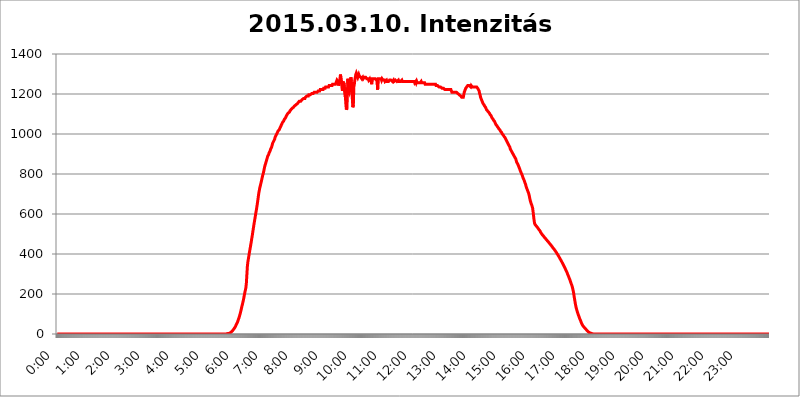
| Category | 2015.03.10. Intenzitás [W/m^2] |
|---|---|
| 0.0 | -0.256 |
| 0.0006944444444444445 | -0.256 |
| 0.001388888888888889 | -0.256 |
| 0.0020833333333333333 | -0.256 |
| 0.002777777777777778 | -0.256 |
| 0.003472222222222222 | -0.256 |
| 0.004166666666666667 | -0.256 |
| 0.004861111111111111 | -0.256 |
| 0.005555555555555556 | -0.256 |
| 0.0062499999999999995 | -0.256 |
| 0.006944444444444444 | -0.256 |
| 0.007638888888888889 | -0.256 |
| 0.008333333333333333 | -0.256 |
| 0.009027777777777779 | -0.256 |
| 0.009722222222222222 | -0.256 |
| 0.010416666666666666 | -0.256 |
| 0.011111111111111112 | -0.256 |
| 0.011805555555555555 | -0.256 |
| 0.012499999999999999 | -0.256 |
| 0.013194444444444444 | -0.256 |
| 0.013888888888888888 | -0.256 |
| 0.014583333333333332 | -0.256 |
| 0.015277777777777777 | -0.256 |
| 0.015972222222222224 | -0.256 |
| 0.016666666666666666 | -0.256 |
| 0.017361111111111112 | -0.256 |
| 0.018055555555555557 | -0.256 |
| 0.01875 | -0.256 |
| 0.019444444444444445 | -0.256 |
| 0.02013888888888889 | -0.256 |
| 0.020833333333333332 | -0.256 |
| 0.02152777777777778 | -0.256 |
| 0.022222222222222223 | -0.256 |
| 0.02291666666666667 | -0.256 |
| 0.02361111111111111 | -0.256 |
| 0.024305555555555556 | -0.256 |
| 0.024999999999999998 | -0.256 |
| 0.025694444444444447 | -0.256 |
| 0.02638888888888889 | -0.256 |
| 0.027083333333333334 | -0.256 |
| 0.027777777777777776 | -0.256 |
| 0.02847222222222222 | -0.256 |
| 0.029166666666666664 | -0.256 |
| 0.029861111111111113 | -0.256 |
| 0.030555555555555555 | -0.256 |
| 0.03125 | -0.256 |
| 0.03194444444444445 | -0.256 |
| 0.03263888888888889 | -0.256 |
| 0.03333333333333333 | -0.256 |
| 0.034027777777777775 | -0.256 |
| 0.034722222222222224 | -0.256 |
| 0.035416666666666666 | -0.256 |
| 0.036111111111111115 | -0.256 |
| 0.03680555555555556 | -0.256 |
| 0.0375 | -0.256 |
| 0.03819444444444444 | -0.256 |
| 0.03888888888888889 | -0.256 |
| 0.03958333333333333 | -0.256 |
| 0.04027777777777778 | -0.256 |
| 0.04097222222222222 | -0.256 |
| 0.041666666666666664 | -0.256 |
| 0.042361111111111106 | -0.256 |
| 0.04305555555555556 | -0.256 |
| 0.043750000000000004 | -0.256 |
| 0.044444444444444446 | -0.256 |
| 0.04513888888888889 | -0.256 |
| 0.04583333333333334 | -0.256 |
| 0.04652777777777778 | -0.256 |
| 0.04722222222222222 | -0.256 |
| 0.04791666666666666 | -0.256 |
| 0.04861111111111111 | -0.256 |
| 0.049305555555555554 | -0.256 |
| 0.049999999999999996 | -0.256 |
| 0.05069444444444445 | -0.256 |
| 0.051388888888888894 | -0.256 |
| 0.052083333333333336 | -0.256 |
| 0.05277777777777778 | -0.256 |
| 0.05347222222222222 | -0.256 |
| 0.05416666666666667 | -0.256 |
| 0.05486111111111111 | -0.256 |
| 0.05555555555555555 | -0.256 |
| 0.05625 | -0.256 |
| 0.05694444444444444 | -0.256 |
| 0.057638888888888885 | -0.256 |
| 0.05833333333333333 | -0.256 |
| 0.05902777777777778 | -0.256 |
| 0.059722222222222225 | -0.256 |
| 0.06041666666666667 | -0.256 |
| 0.061111111111111116 | -0.256 |
| 0.06180555555555556 | -0.256 |
| 0.0625 | -0.256 |
| 0.06319444444444444 | -0.256 |
| 0.06388888888888888 | -0.256 |
| 0.06458333333333334 | -0.256 |
| 0.06527777777777778 | -0.256 |
| 0.06597222222222222 | -0.256 |
| 0.06666666666666667 | -0.256 |
| 0.06736111111111111 | -0.256 |
| 0.06805555555555555 | -0.256 |
| 0.06874999999999999 | -0.256 |
| 0.06944444444444443 | -0.256 |
| 0.07013888888888889 | -0.256 |
| 0.07083333333333333 | -0.256 |
| 0.07152777777777779 | -0.256 |
| 0.07222222222222223 | -0.256 |
| 0.07291666666666667 | -0.256 |
| 0.07361111111111111 | -0.256 |
| 0.07430555555555556 | -0.256 |
| 0.075 | -0.256 |
| 0.07569444444444444 | -0.256 |
| 0.0763888888888889 | -0.256 |
| 0.07708333333333334 | -0.256 |
| 0.07777777777777778 | -0.256 |
| 0.07847222222222222 | -0.256 |
| 0.07916666666666666 | -0.256 |
| 0.0798611111111111 | -0.256 |
| 0.08055555555555556 | -0.256 |
| 0.08125 | -0.256 |
| 0.08194444444444444 | -0.256 |
| 0.08263888888888889 | -0.256 |
| 0.08333333333333333 | -0.256 |
| 0.08402777777777777 | -0.256 |
| 0.08472222222222221 | -0.256 |
| 0.08541666666666665 | -0.256 |
| 0.08611111111111112 | -0.256 |
| 0.08680555555555557 | -0.256 |
| 0.08750000000000001 | -0.256 |
| 0.08819444444444445 | -0.256 |
| 0.08888888888888889 | -0.256 |
| 0.08958333333333333 | -0.256 |
| 0.09027777777777778 | -0.256 |
| 0.09097222222222222 | -0.256 |
| 0.09166666666666667 | -0.256 |
| 0.09236111111111112 | -0.256 |
| 0.09305555555555556 | -0.256 |
| 0.09375 | -0.256 |
| 0.09444444444444444 | -0.256 |
| 0.09513888888888888 | -0.256 |
| 0.09583333333333333 | -0.256 |
| 0.09652777777777777 | -0.256 |
| 0.09722222222222222 | -0.256 |
| 0.09791666666666667 | -0.256 |
| 0.09861111111111111 | -0.256 |
| 0.09930555555555555 | -0.256 |
| 0.09999999999999999 | -0.256 |
| 0.10069444444444443 | -0.256 |
| 0.1013888888888889 | -0.256 |
| 0.10208333333333335 | -0.256 |
| 0.10277777777777779 | -0.256 |
| 0.10347222222222223 | -0.256 |
| 0.10416666666666667 | -0.256 |
| 0.10486111111111111 | -0.256 |
| 0.10555555555555556 | -0.256 |
| 0.10625 | -0.256 |
| 0.10694444444444444 | -0.256 |
| 0.1076388888888889 | -0.256 |
| 0.10833333333333334 | -0.256 |
| 0.10902777777777778 | -0.256 |
| 0.10972222222222222 | -0.256 |
| 0.1111111111111111 | -0.256 |
| 0.11180555555555556 | -0.256 |
| 0.11180555555555556 | -0.256 |
| 0.1125 | -0.256 |
| 0.11319444444444444 | -0.256 |
| 0.11388888888888889 | -0.256 |
| 0.11458333333333333 | -0.256 |
| 0.11527777777777777 | -0.256 |
| 0.11597222222222221 | -0.256 |
| 0.11666666666666665 | -0.256 |
| 0.1173611111111111 | -0.256 |
| 0.11805555555555557 | -0.256 |
| 0.11944444444444445 | -0.256 |
| 0.12013888888888889 | -0.256 |
| 0.12083333333333333 | -0.256 |
| 0.12152777777777778 | -0.256 |
| 0.12222222222222223 | -0.256 |
| 0.12291666666666667 | -0.256 |
| 0.12291666666666667 | -0.256 |
| 0.12361111111111112 | -0.256 |
| 0.12430555555555556 | -0.256 |
| 0.125 | -0.256 |
| 0.12569444444444444 | -0.256 |
| 0.12638888888888888 | -0.256 |
| 0.12708333333333333 | -0.256 |
| 0.16875 | -0.256 |
| 0.12847222222222224 | -0.256 |
| 0.12916666666666668 | -0.256 |
| 0.12986111111111112 | -0.256 |
| 0.13055555555555556 | -0.256 |
| 0.13125 | -0.256 |
| 0.13194444444444445 | -0.256 |
| 0.1326388888888889 | -0.256 |
| 0.13333333333333333 | -0.256 |
| 0.13402777777777777 | -0.256 |
| 0.13402777777777777 | -0.256 |
| 0.13472222222222222 | -0.256 |
| 0.13541666666666666 | -0.256 |
| 0.1361111111111111 | -0.256 |
| 0.13749999999999998 | -0.256 |
| 0.13819444444444443 | -0.256 |
| 0.1388888888888889 | -0.256 |
| 0.13958333333333334 | -0.256 |
| 0.14027777777777778 | -0.256 |
| 0.14097222222222222 | -0.256 |
| 0.14166666666666666 | -0.256 |
| 0.1423611111111111 | -0.256 |
| 0.14305555555555557 | -0.256 |
| 0.14375000000000002 | -0.256 |
| 0.14444444444444446 | -0.256 |
| 0.1451388888888889 | -0.256 |
| 0.1451388888888889 | -0.256 |
| 0.14652777777777778 | -0.256 |
| 0.14722222222222223 | -0.256 |
| 0.14791666666666667 | -0.256 |
| 0.1486111111111111 | -0.256 |
| 0.14930555555555555 | -0.256 |
| 0.15 | -0.256 |
| 0.15069444444444444 | -0.256 |
| 0.15138888888888888 | -0.256 |
| 0.15208333333333332 | -0.256 |
| 0.15277777777777776 | -0.256 |
| 0.15347222222222223 | -0.256 |
| 0.15416666666666667 | -0.256 |
| 0.15486111111111112 | -0.256 |
| 0.15555555555555556 | -0.256 |
| 0.15625 | -0.256 |
| 0.15694444444444444 | -0.256 |
| 0.15763888888888888 | -0.256 |
| 0.15833333333333333 | -0.256 |
| 0.15902777777777777 | -0.256 |
| 0.15972222222222224 | -0.256 |
| 0.16041666666666668 | -0.256 |
| 0.16111111111111112 | -0.256 |
| 0.16180555555555556 | -0.256 |
| 0.1625 | -0.256 |
| 0.16319444444444445 | -0.256 |
| 0.1638888888888889 | -0.256 |
| 0.16458333333333333 | -0.256 |
| 0.16527777777777777 | -0.256 |
| 0.16597222222222222 | -0.256 |
| 0.16666666666666666 | -0.256 |
| 0.1673611111111111 | -0.256 |
| 0.16805555555555554 | -0.256 |
| 0.16874999999999998 | -0.256 |
| 0.16944444444444443 | -0.256 |
| 0.17013888888888887 | -0.256 |
| 0.1708333333333333 | -0.256 |
| 0.17152777777777775 | -0.256 |
| 0.17222222222222225 | -0.256 |
| 0.1729166666666667 | -0.256 |
| 0.17361111111111113 | -0.256 |
| 0.17430555555555557 | -0.256 |
| 0.17500000000000002 | -0.256 |
| 0.17569444444444446 | -0.256 |
| 0.1763888888888889 | -0.256 |
| 0.17708333333333334 | -0.256 |
| 0.17777777777777778 | -0.256 |
| 0.17847222222222223 | -0.256 |
| 0.17916666666666667 | -0.256 |
| 0.1798611111111111 | -0.256 |
| 0.18055555555555555 | -0.256 |
| 0.18125 | -0.256 |
| 0.18194444444444444 | -0.256 |
| 0.1826388888888889 | -0.256 |
| 0.18333333333333335 | -0.256 |
| 0.1840277777777778 | -0.256 |
| 0.18472222222222223 | -0.256 |
| 0.18541666666666667 | -0.256 |
| 0.18611111111111112 | -0.256 |
| 0.18680555555555556 | -0.256 |
| 0.1875 | -0.256 |
| 0.18819444444444444 | -0.256 |
| 0.18888888888888888 | -0.256 |
| 0.18958333333333333 | -0.256 |
| 0.19027777777777777 | -0.256 |
| 0.1909722222222222 | -0.256 |
| 0.19166666666666665 | -0.256 |
| 0.19236111111111112 | -0.256 |
| 0.19305555555555554 | -0.256 |
| 0.19375 | -0.256 |
| 0.19444444444444445 | -0.256 |
| 0.1951388888888889 | -0.256 |
| 0.19583333333333333 | -0.256 |
| 0.19652777777777777 | -0.256 |
| 0.19722222222222222 | -0.256 |
| 0.19791666666666666 | -0.256 |
| 0.1986111111111111 | -0.256 |
| 0.19930555555555554 | -0.256 |
| 0.19999999999999998 | -0.256 |
| 0.20069444444444443 | -0.256 |
| 0.20138888888888887 | -0.256 |
| 0.2020833333333333 | -0.256 |
| 0.2027777777777778 | -0.256 |
| 0.2034722222222222 | -0.256 |
| 0.2041666666666667 | -0.256 |
| 0.20486111111111113 | -0.256 |
| 0.20555555555555557 | -0.256 |
| 0.20625000000000002 | -0.256 |
| 0.20694444444444446 | -0.256 |
| 0.2076388888888889 | -0.256 |
| 0.20833333333333334 | -0.256 |
| 0.20902777777777778 | -0.256 |
| 0.20972222222222223 | -0.256 |
| 0.21041666666666667 | -0.256 |
| 0.2111111111111111 | -0.256 |
| 0.21180555555555555 | -0.256 |
| 0.2125 | -0.256 |
| 0.21319444444444444 | -0.256 |
| 0.2138888888888889 | -0.256 |
| 0.21458333333333335 | -0.256 |
| 0.2152777777777778 | -0.256 |
| 0.21597222222222223 | -0.256 |
| 0.21666666666666667 | -0.256 |
| 0.21736111111111112 | -0.256 |
| 0.21805555555555556 | -0.256 |
| 0.21875 | -0.256 |
| 0.21944444444444444 | -0.256 |
| 0.22013888888888888 | -0.256 |
| 0.22083333333333333 | -0.256 |
| 0.22152777777777777 | -0.256 |
| 0.2222222222222222 | -0.256 |
| 0.22291666666666665 | -0.256 |
| 0.2236111111111111 | -0.256 |
| 0.22430555555555556 | -0.256 |
| 0.225 | -0.256 |
| 0.22569444444444445 | -0.256 |
| 0.2263888888888889 | -0.256 |
| 0.22708333333333333 | -0.256 |
| 0.22777777777777777 | -0.256 |
| 0.22847222222222222 | -0.256 |
| 0.22916666666666666 | -0.256 |
| 0.2298611111111111 | -0.256 |
| 0.23055555555555554 | -0.256 |
| 0.23124999999999998 | -0.256 |
| 0.23194444444444443 | -0.256 |
| 0.23263888888888887 | -0.256 |
| 0.2333333333333333 | -0.256 |
| 0.2340277777777778 | -0.256 |
| 0.2347222222222222 | -0.256 |
| 0.2354166666666667 | -0.256 |
| 0.23611111111111113 | -0.256 |
| 0.23680555555555557 | -0.256 |
| 0.23750000000000002 | 1.09 |
| 0.23819444444444446 | 1.09 |
| 0.2388888888888889 | 1.09 |
| 0.23958333333333334 | 2.439 |
| 0.24027777777777778 | 2.439 |
| 0.24097222222222223 | 3.791 |
| 0.24166666666666667 | 3.791 |
| 0.2423611111111111 | 6.503 |
| 0.24305555555555555 | 7.862 |
| 0.24375 | 9.225 |
| 0.24444444444444446 | 10.589 |
| 0.24513888888888888 | 13.325 |
| 0.24583333333333335 | 16.069 |
| 0.2465277777777778 | 18.822 |
| 0.24722222222222223 | 22.965 |
| 0.24791666666666667 | 25.736 |
| 0.24861111111111112 | 29.905 |
| 0.24930555555555556 | 34.086 |
| 0.25 | 38.28 |
| 0.25069444444444444 | 43.886 |
| 0.2513888888888889 | 48.1 |
| 0.2520833333333333 | 53.73 |
| 0.25277777777777777 | 59.368 |
| 0.2534722222222222 | 66.423 |
| 0.25416666666666665 | 73.481 |
| 0.2548611111111111 | 80.536 |
| 0.2555555555555556 | 88.991 |
| 0.25625000000000003 | 97.427 |
| 0.2569444444444445 | 107.232 |
| 0.2576388888888889 | 116.989 |
| 0.25833333333333336 | 128.065 |
| 0.2590277777777778 | 139.051 |
| 0.25972222222222224 | 148.579 |
| 0.2604166666666667 | 159.364 |
| 0.2611111111111111 | 170.029 |
| 0.26180555555555557 | 183.184 |
| 0.2625 | 196.135 |
| 0.26319444444444445 | 208.881 |
| 0.2638888888888889 | 220.177 |
| 0.26458333333333334 | 232.54 |
| 0.2652777777777778 | 255.528 |
| 0.2659722222222222 | 297.728 |
| 0.26666666666666666 | 338.278 |
| 0.2673611111111111 | 360.798 |
| 0.26805555555555555 | 375.442 |
| 0.26875 | 390.55 |
| 0.26944444444444443 | 406.25 |
| 0.2701388888888889 | 419.883 |
| 0.2708333333333333 | 434.107 |
| 0.27152777777777776 | 449.011 |
| 0.2722222222222222 | 463.083 |
| 0.27291666666666664 | 479.541 |
| 0.2736111111111111 | 493.398 |
| 0.2743055555555555 | 511.671 |
| 0.27499999999999997 | 527.122 |
| 0.27569444444444446 | 543.376 |
| 0.27638888888888885 | 558.305 |
| 0.27708333333333335 | 573.939 |
| 0.2777777777777778 | 587.934 |
| 0.27847222222222223 | 604.992 |
| 0.2791666666666667 | 617.682 |
| 0.2798611111111111 | 633.495 |
| 0.28055555555555556 | 649.973 |
| 0.28125 | 667.146 |
| 0.28194444444444444 | 685.046 |
| 0.2826388888888889 | 703.704 |
| 0.2833333333333333 | 716.58 |
| 0.28402777777777777 | 729.817 |
| 0.2847222222222222 | 739.988 |
| 0.28541666666666665 | 750.371 |
| 0.28611111111111115 | 760.972 |
| 0.28680555555555554 | 771.794 |
| 0.28750000000000003 | 782.842 |
| 0.2881944444444445 | 794.119 |
| 0.2888888888888889 | 801.768 |
| 0.28958333333333336 | 813.439 |
| 0.2902777777777778 | 825.351 |
| 0.29097222222222224 | 837.51 |
| 0.2916666666666667 | 845.755 |
| 0.2923611111111111 | 854.113 |
| 0.29305555555555557 | 862.585 |
| 0.29375 | 871.173 |
| 0.29444444444444445 | 879.878 |
| 0.2951388888888889 | 888.701 |
| 0.29583333333333334 | 893.157 |
| 0.2965277777777778 | 897.643 |
| 0.2972222222222222 | 906.707 |
| 0.29791666666666666 | 911.285 |
| 0.2986111111111111 | 915.893 |
| 0.29930555555555555 | 925.203 |
| 0.3 | 929.905 |
| 0.30069444444444443 | 934.639 |
| 0.3013888888888889 | 944.201 |
| 0.3020833333333333 | 953.892 |
| 0.30277777777777776 | 958.785 |
| 0.3034722222222222 | 963.712 |
| 0.30416666666666664 | 968.671 |
| 0.3048611111111111 | 973.663 |
| 0.3055555555555555 | 983.747 |
| 0.30624999999999997 | 988.839 |
| 0.3069444444444444 | 993.965 |
| 0.3076388888888889 | 999.125 |
| 0.30833333333333335 | 1004.318 |
| 0.3090277777777778 | 1009.546 |
| 0.30972222222222223 | 1014.809 |
| 0.3104166666666667 | 1014.809 |
| 0.3111111111111111 | 1020.106 |
| 0.31180555555555556 | 1025.437 |
| 0.3125 | 1030.804 |
| 0.31319444444444444 | 1036.206 |
| 0.3138888888888889 | 1041.644 |
| 0.3145833333333333 | 1047.117 |
| 0.31527777777777777 | 1052.625 |
| 0.3159722222222222 | 1058.17 |
| 0.31666666666666665 | 1058.17 |
| 0.31736111111111115 | 1063.751 |
| 0.31805555555555554 | 1069.368 |
| 0.31875000000000003 | 1075.021 |
| 0.3194444444444445 | 1075.021 |
| 0.3201388888888889 | 1080.711 |
| 0.32083333333333336 | 1080.711 |
| 0.3215277777777778 | 1092.203 |
| 0.32222222222222224 | 1092.203 |
| 0.3229166666666667 | 1092.203 |
| 0.3236111111111111 | 1103.843 |
| 0.32430555555555557 | 1103.843 |
| 0.325 | 1103.843 |
| 0.32569444444444445 | 1109.72 |
| 0.3263888888888889 | 1115.634 |
| 0.32708333333333334 | 1115.634 |
| 0.3277777777777778 | 1121.587 |
| 0.3284722222222222 | 1121.587 |
| 0.32916666666666666 | 1127.578 |
| 0.3298611111111111 | 1127.578 |
| 0.33055555555555555 | 1127.578 |
| 0.33125 | 1133.607 |
| 0.33194444444444443 | 1133.607 |
| 0.3326388888888889 | 1139.675 |
| 0.3333333333333333 | 1139.675 |
| 0.3340277777777778 | 1139.675 |
| 0.3347222222222222 | 1145.782 |
| 0.3354166666666667 | 1145.782 |
| 0.3361111111111111 | 1145.782 |
| 0.3368055555555556 | 1151.928 |
| 0.33749999999999997 | 1151.928 |
| 0.33819444444444446 | 1158.113 |
| 0.33888888888888885 | 1158.113 |
| 0.33958333333333335 | 1164.337 |
| 0.34027777777777773 | 1164.337 |
| 0.34097222222222223 | 1164.337 |
| 0.3416666666666666 | 1164.337 |
| 0.3423611111111111 | 1164.337 |
| 0.3430555555555555 | 1170.601 |
| 0.34375 | 1170.601 |
| 0.3444444444444445 | 1170.601 |
| 0.3451388888888889 | 1176.905 |
| 0.3458333333333334 | 1176.905 |
| 0.34652777777777777 | 1176.905 |
| 0.34722222222222227 | 1176.905 |
| 0.34791666666666665 | 1183.249 |
| 0.34861111111111115 | 1183.249 |
| 0.34930555555555554 | 1183.249 |
| 0.35000000000000003 | 1189.633 |
| 0.3506944444444444 | 1189.633 |
| 0.3513888888888889 | 1189.633 |
| 0.3520833333333333 | 1189.633 |
| 0.3527777777777778 | 1196.058 |
| 0.3534722222222222 | 1196.058 |
| 0.3541666666666667 | 1196.058 |
| 0.3548611111111111 | 1196.058 |
| 0.35555555555555557 | 1196.058 |
| 0.35625 | 1196.058 |
| 0.35694444444444445 | 1202.523 |
| 0.3576388888888889 | 1202.523 |
| 0.35833333333333334 | 1202.523 |
| 0.3590277777777778 | 1202.523 |
| 0.3597222222222222 | 1202.523 |
| 0.36041666666666666 | 1209.029 |
| 0.3611111111111111 | 1209.029 |
| 0.36180555555555555 | 1209.029 |
| 0.3625 | 1209.029 |
| 0.36319444444444443 | 1209.029 |
| 0.3638888888888889 | 1209.029 |
| 0.3645833333333333 | 1209.029 |
| 0.3652777777777778 | 1209.029 |
| 0.3659722222222222 | 1215.576 |
| 0.3666666666666667 | 1215.576 |
| 0.3673611111111111 | 1215.576 |
| 0.3680555555555556 | 1215.576 |
| 0.36874999999999997 | 1222.164 |
| 0.36944444444444446 | 1222.164 |
| 0.37013888888888885 | 1222.164 |
| 0.37083333333333335 | 1222.164 |
| 0.37152777777777773 | 1222.164 |
| 0.37222222222222223 | 1222.164 |
| 0.3729166666666666 | 1222.164 |
| 0.3736111111111111 | 1228.794 |
| 0.3743055555555555 | 1228.794 |
| 0.375 | 1228.794 |
| 0.3756944444444445 | 1228.794 |
| 0.3763888888888889 | 1235.465 |
| 0.3770833333333334 | 1235.465 |
| 0.37777777777777777 | 1235.465 |
| 0.37847222222222227 | 1235.465 |
| 0.37916666666666665 | 1235.465 |
| 0.37986111111111115 | 1235.465 |
| 0.38055555555555554 | 1235.465 |
| 0.38125000000000003 | 1242.179 |
| 0.3819444444444444 | 1242.179 |
| 0.3826388888888889 | 1242.179 |
| 0.3833333333333333 | 1242.179 |
| 0.3840277777777778 | 1242.179 |
| 0.3847222222222222 | 1242.179 |
| 0.3854166666666667 | 1242.179 |
| 0.3861111111111111 | 1248.934 |
| 0.38680555555555557 | 1248.934 |
| 0.3875 | 1248.934 |
| 0.38819444444444445 | 1248.934 |
| 0.3888888888888889 | 1248.934 |
| 0.38958333333333334 | 1248.934 |
| 0.3902777777777778 | 1248.934 |
| 0.3909722222222222 | 1248.934 |
| 0.39166666666666666 | 1248.934 |
| 0.3923611111111111 | 1269.454 |
| 0.39305555555555555 | 1269.454 |
| 0.39375 | 1262.571 |
| 0.39444444444444443 | 1242.179 |
| 0.3951388888888889 | 1248.934 |
| 0.3958333333333333 | 1248.934 |
| 0.3965277777777778 | 1276.38 |
| 0.3972222222222222 | 1297.416 |
| 0.3979166666666667 | 1297.416 |
| 0.3986111111111111 | 1255.731 |
| 0.3993055555555556 | 1255.731 |
| 0.39999999999999997 | 1215.576 |
| 0.40069444444444446 | 1262.571 |
| 0.40138888888888885 | 1248.934 |
| 0.40208333333333335 | 1255.731 |
| 0.40277777777777773 | 1255.731 |
| 0.40347222222222223 | 1255.731 |
| 0.4041666666666666 | 1183.249 |
| 0.4048611111111111 | 1145.782 |
| 0.4055555555555555 | 1121.587 |
| 0.40625 | 1127.578 |
| 0.4069444444444445 | 1196.058 |
| 0.4076388888888889 | 1276.38 |
| 0.4083333333333334 | 1222.164 |
| 0.40902777777777777 | 1222.164 |
| 0.40972222222222227 | 1209.029 |
| 0.41041666666666665 | 1209.029 |
| 0.41111111111111115 | 1235.465 |
| 0.41180555555555554 | 1283.348 |
| 0.41250000000000003 | 1262.571 |
| 0.4131944444444444 | 1222.164 |
| 0.4138888888888889 | 1176.905 |
| 0.4145833333333333 | 1133.607 |
| 0.4152777777777778 | 1145.782 |
| 0.4159722222222222 | 1235.465 |
| 0.4166666666666667 | 1248.934 |
| 0.4173611111111111 | 1269.454 |
| 0.41805555555555557 | 1269.454 |
| 0.41875 | 1297.416 |
| 0.41944444444444445 | 1304.515 |
| 0.4201388888888889 | 1297.416 |
| 0.42083333333333334 | 1290.36 |
| 0.4215277777777778 | 1283.348 |
| 0.4222222222222222 | 1290.36 |
| 0.42291666666666666 | 1297.416 |
| 0.4236111111111111 | 1290.36 |
| 0.42430555555555555 | 1290.36 |
| 0.425 | 1290.36 |
| 0.42569444444444443 | 1283.348 |
| 0.4263888888888889 | 1283.348 |
| 0.4270833333333333 | 1276.38 |
| 0.4277777777777778 | 1276.38 |
| 0.4284722222222222 | 1283.348 |
| 0.4291666666666667 | 1276.38 |
| 0.4298611111111111 | 1276.38 |
| 0.4305555555555556 | 1283.348 |
| 0.43124999999999997 | 1283.348 |
| 0.43194444444444446 | 1283.348 |
| 0.43263888888888885 | 1283.348 |
| 0.43333333333333335 | 1283.348 |
| 0.43402777777777773 | 1276.38 |
| 0.43472222222222223 | 1276.38 |
| 0.4354166666666666 | 1276.38 |
| 0.4361111111111111 | 1276.38 |
| 0.4368055555555555 | 1269.454 |
| 0.4375 | 1269.454 |
| 0.4381944444444445 | 1276.38 |
| 0.4388888888888889 | 1269.454 |
| 0.4395833333333334 | 1269.454 |
| 0.44027777777777777 | 1262.571 |
| 0.44097222222222227 | 1248.934 |
| 0.44166666666666665 | 1276.38 |
| 0.44236111111111115 | 1276.38 |
| 0.44305555555555554 | 1276.38 |
| 0.44375000000000003 | 1276.38 |
| 0.4444444444444444 | 1276.38 |
| 0.4451388888888889 | 1276.38 |
| 0.4458333333333333 | 1276.38 |
| 0.4465277777777778 | 1276.38 |
| 0.4472222222222222 | 1276.38 |
| 0.4479166666666667 | 1269.454 |
| 0.4486111111111111 | 1276.38 |
| 0.44930555555555557 | 1222.164 |
| 0.45 | 1276.38 |
| 0.45069444444444445 | 1276.38 |
| 0.4513888888888889 | 1276.38 |
| 0.45208333333333334 | 1276.38 |
| 0.4527777777777778 | 1276.38 |
| 0.4534722222222222 | 1276.38 |
| 0.45416666666666666 | 1276.38 |
| 0.4548611111111111 | 1269.454 |
| 0.45555555555555555 | 1276.38 |
| 0.45625 | 1276.38 |
| 0.45694444444444443 | 1269.454 |
| 0.4576388888888889 | 1269.454 |
| 0.4583333333333333 | 1269.454 |
| 0.4590277777777778 | 1269.454 |
| 0.4597222222222222 | 1262.571 |
| 0.4604166666666667 | 1262.571 |
| 0.4611111111111111 | 1262.571 |
| 0.4618055555555556 | 1269.454 |
| 0.46249999999999997 | 1262.571 |
| 0.46319444444444446 | 1262.571 |
| 0.46388888888888885 | 1262.571 |
| 0.46458333333333335 | 1262.571 |
| 0.46527777777777773 | 1262.571 |
| 0.46597222222222223 | 1269.454 |
| 0.4666666666666666 | 1269.454 |
| 0.4673611111111111 | 1269.454 |
| 0.4680555555555555 | 1269.454 |
| 0.46875 | 1269.454 |
| 0.4694444444444445 | 1269.454 |
| 0.4701388888888889 | 1262.571 |
| 0.4708333333333334 | 1262.571 |
| 0.47152777777777777 | 1269.454 |
| 0.47222222222222227 | 1262.571 |
| 0.47291666666666665 | 1262.571 |
| 0.47361111111111115 | 1262.571 |
| 0.47430555555555554 | 1269.454 |
| 0.47500000000000003 | 1269.454 |
| 0.4756944444444444 | 1269.454 |
| 0.4763888888888889 | 1262.571 |
| 0.4770833333333333 | 1262.571 |
| 0.4777777777777778 | 1262.571 |
| 0.4784722222222222 | 1269.454 |
| 0.4791666666666667 | 1262.571 |
| 0.4798611111111111 | 1262.571 |
| 0.48055555555555557 | 1262.571 |
| 0.48125 | 1262.571 |
| 0.48194444444444445 | 1262.571 |
| 0.4826388888888889 | 1262.571 |
| 0.48333333333333334 | 1269.454 |
| 0.4840277777777778 | 1262.571 |
| 0.4847222222222222 | 1262.571 |
| 0.48541666666666666 | 1262.571 |
| 0.4861111111111111 | 1262.571 |
| 0.48680555555555555 | 1262.571 |
| 0.4875 | 1262.571 |
| 0.48819444444444443 | 1262.571 |
| 0.4888888888888889 | 1262.571 |
| 0.4895833333333333 | 1262.571 |
| 0.4902777777777778 | 1262.571 |
| 0.4909722222222222 | 1262.571 |
| 0.4916666666666667 | 1262.571 |
| 0.4923611111111111 | 1262.571 |
| 0.4930555555555556 | 1262.571 |
| 0.49374999999999997 | 1262.571 |
| 0.49444444444444446 | 1262.571 |
| 0.49513888888888885 | 1262.571 |
| 0.49583333333333335 | 1262.571 |
| 0.49652777777777773 | 1262.571 |
| 0.49722222222222223 | 1262.571 |
| 0.4979166666666666 | 1262.571 |
| 0.4986111111111111 | 1262.571 |
| 0.4993055555555555 | 1262.571 |
| 0.5 | 1262.571 |
| 0.5006944444444444 | 1262.571 |
| 0.5013888888888889 | 1255.731 |
| 0.5020833333333333 | 1255.731 |
| 0.5027777777777778 | 1262.571 |
| 0.5034722222222222 | 1255.731 |
| 0.5041666666666667 | 1262.571 |
| 0.5048611111111111 | 1255.731 |
| 0.5055555555555555 | 1255.731 |
| 0.50625 | 1255.731 |
| 0.5069444444444444 | 1255.731 |
| 0.5076388888888889 | 1255.731 |
| 0.5083333333333333 | 1255.731 |
| 0.5090277777777777 | 1255.731 |
| 0.5097222222222222 | 1255.731 |
| 0.5104166666666666 | 1262.571 |
| 0.5111111111111112 | 1255.731 |
| 0.5118055555555555 | 1255.731 |
| 0.5125000000000001 | 1255.731 |
| 0.5131944444444444 | 1255.731 |
| 0.513888888888889 | 1255.731 |
| 0.5145833333333333 | 1255.731 |
| 0.5152777777777778 | 1255.731 |
| 0.5159722222222222 | 1248.934 |
| 0.5166666666666667 | 1248.934 |
| 0.517361111111111 | 1248.934 |
| 0.5180555555555556 | 1248.934 |
| 0.5187499999999999 | 1248.934 |
| 0.5194444444444445 | 1248.934 |
| 0.5201388888888888 | 1248.934 |
| 0.5208333333333334 | 1248.934 |
| 0.5215277777777778 | 1248.934 |
| 0.5222222222222223 | 1248.934 |
| 0.5229166666666667 | 1248.934 |
| 0.5236111111111111 | 1248.934 |
| 0.5243055555555556 | 1248.934 |
| 0.525 | 1248.934 |
| 0.5256944444444445 | 1248.934 |
| 0.5263888888888889 | 1248.934 |
| 0.5270833333333333 | 1248.934 |
| 0.5277777777777778 | 1248.934 |
| 0.5284722222222222 | 1248.934 |
| 0.5291666666666667 | 1248.934 |
| 0.5298611111111111 | 1248.934 |
| 0.5305555555555556 | 1248.934 |
| 0.53125 | 1242.179 |
| 0.5319444444444444 | 1242.179 |
| 0.5326388888888889 | 1242.179 |
| 0.5333333333333333 | 1242.179 |
| 0.5340277777777778 | 1242.179 |
| 0.5347222222222222 | 1242.179 |
| 0.5354166666666667 | 1235.465 |
| 0.5361111111111111 | 1235.465 |
| 0.5368055555555555 | 1235.465 |
| 0.5375 | 1235.465 |
| 0.5381944444444444 | 1235.465 |
| 0.5388888888888889 | 1235.465 |
| 0.5395833333333333 | 1228.794 |
| 0.5402777777777777 | 1228.794 |
| 0.5409722222222222 | 1228.794 |
| 0.5416666666666666 | 1228.794 |
| 0.5423611111111112 | 1228.794 |
| 0.5430555555555555 | 1228.794 |
| 0.5437500000000001 | 1222.164 |
| 0.5444444444444444 | 1222.164 |
| 0.545138888888889 | 1222.164 |
| 0.5458333333333333 | 1222.164 |
| 0.5465277777777778 | 1222.164 |
| 0.5472222222222222 | 1222.164 |
| 0.5479166666666667 | 1222.164 |
| 0.548611111111111 | 1222.164 |
| 0.5493055555555556 | 1222.164 |
| 0.5499999999999999 | 1222.164 |
| 0.5506944444444445 | 1222.164 |
| 0.5513888888888888 | 1222.164 |
| 0.5520833333333334 | 1222.164 |
| 0.5527777777777778 | 1215.576 |
| 0.5534722222222223 | 1209.029 |
| 0.5541666666666667 | 1209.029 |
| 0.5548611111111111 | 1209.029 |
| 0.5555555555555556 | 1209.029 |
| 0.55625 | 1209.029 |
| 0.5569444444444445 | 1209.029 |
| 0.5576388888888889 | 1209.029 |
| 0.5583333333333333 | 1209.029 |
| 0.5590277777777778 | 1209.029 |
| 0.5597222222222222 | 1209.029 |
| 0.5604166666666667 | 1209.029 |
| 0.5611111111111111 | 1209.029 |
| 0.5618055555555556 | 1202.523 |
| 0.5625 | 1202.523 |
| 0.5631944444444444 | 1202.523 |
| 0.5638888888888889 | 1196.058 |
| 0.5645833333333333 | 1196.058 |
| 0.5652777777777778 | 1196.058 |
| 0.5659722222222222 | 1189.633 |
| 0.5666666666666667 | 1189.633 |
| 0.5673611111111111 | 1183.249 |
| 0.5680555555555555 | 1183.249 |
| 0.56875 | 1183.249 |
| 0.5694444444444444 | 1183.249 |
| 0.5701388888888889 | 1196.058 |
| 0.5708333333333333 | 1209.029 |
| 0.5715277777777777 | 1215.576 |
| 0.5722222222222222 | 1222.164 |
| 0.5729166666666666 | 1228.794 |
| 0.5736111111111112 | 1228.794 |
| 0.5743055555555555 | 1235.465 |
| 0.5750000000000001 | 1235.465 |
| 0.5756944444444444 | 1242.179 |
| 0.576388888888889 | 1242.179 |
| 0.5770833333333333 | 1242.179 |
| 0.5777777777777778 | 1242.179 |
| 0.5784722222222222 | 1242.179 |
| 0.5791666666666667 | 1242.179 |
| 0.579861111111111 | 1235.465 |
| 0.5805555555555556 | 1242.179 |
| 0.5812499999999999 | 1242.179 |
| 0.5819444444444445 | 1235.465 |
| 0.5826388888888888 | 1235.465 |
| 0.5833333333333334 | 1235.465 |
| 0.5840277777777778 | 1235.465 |
| 0.5847222222222223 | 1235.465 |
| 0.5854166666666667 | 1235.465 |
| 0.5861111111111111 | 1235.465 |
| 0.5868055555555556 | 1235.465 |
| 0.5875 | 1235.465 |
| 0.5881944444444445 | 1235.465 |
| 0.5888888888888889 | 1235.465 |
| 0.5895833333333333 | 1228.794 |
| 0.5902777777777778 | 1228.794 |
| 0.5909722222222222 | 1228.794 |
| 0.5916666666666667 | 1215.576 |
| 0.5923611111111111 | 1202.523 |
| 0.5930555555555556 | 1196.058 |
| 0.59375 | 1183.249 |
| 0.5944444444444444 | 1176.905 |
| 0.5951388888888889 | 1170.601 |
| 0.5958333333333333 | 1164.337 |
| 0.5965277777777778 | 1158.113 |
| 0.5972222222222222 | 1151.928 |
| 0.5979166666666667 | 1151.928 |
| 0.5986111111111111 | 1145.782 |
| 0.5993055555555555 | 1139.675 |
| 0.6 | 1139.675 |
| 0.6006944444444444 | 1133.607 |
| 0.6013888888888889 | 1127.578 |
| 0.6020833333333333 | 1121.587 |
| 0.6027777777777777 | 1121.587 |
| 0.6034722222222222 | 1115.634 |
| 0.6041666666666666 | 1115.634 |
| 0.6048611111111112 | 1109.72 |
| 0.6055555555555555 | 1109.72 |
| 0.6062500000000001 | 1103.843 |
| 0.6069444444444444 | 1098.004 |
| 0.607638888888889 | 1098.004 |
| 0.6083333333333333 | 1092.203 |
| 0.6090277777777778 | 1086.439 |
| 0.6097222222222222 | 1080.711 |
| 0.6104166666666667 | 1080.711 |
| 0.611111111111111 | 1075.021 |
| 0.6118055555555556 | 1069.368 |
| 0.6124999999999999 | 1069.368 |
| 0.6131944444444445 | 1063.751 |
| 0.6138888888888888 | 1058.17 |
| 0.6145833333333334 | 1052.625 |
| 0.6152777777777778 | 1047.117 |
| 0.6159722222222223 | 1047.117 |
| 0.6166666666666667 | 1041.644 |
| 0.6173611111111111 | 1036.206 |
| 0.6180555555555556 | 1036.206 |
| 0.61875 | 1030.804 |
| 0.6194444444444445 | 1025.437 |
| 0.6201388888888889 | 1025.437 |
| 0.6208333333333333 | 1020.106 |
| 0.6215277777777778 | 1014.809 |
| 0.6222222222222222 | 1014.809 |
| 0.6229166666666667 | 1009.546 |
| 0.6236111111111111 | 1004.318 |
| 0.6243055555555556 | 999.125 |
| 0.625 | 999.125 |
| 0.6256944444444444 | 993.965 |
| 0.6263888888888889 | 988.839 |
| 0.6270833333333333 | 988.839 |
| 0.6277777777777778 | 983.747 |
| 0.6284722222222222 | 978.688 |
| 0.6291666666666667 | 973.663 |
| 0.6298611111111111 | 968.671 |
| 0.6305555555555555 | 963.712 |
| 0.63125 | 958.785 |
| 0.6319444444444444 | 953.892 |
| 0.6326388888888889 | 949.03 |
| 0.6333333333333333 | 944.201 |
| 0.6340277777777777 | 939.404 |
| 0.6347222222222222 | 934.639 |
| 0.6354166666666666 | 925.203 |
| 0.6361111111111112 | 925.203 |
| 0.6368055555555555 | 915.893 |
| 0.6375000000000001 | 915.893 |
| 0.6381944444444444 | 911.285 |
| 0.638888888888889 | 902.16 |
| 0.6395833333333333 | 897.643 |
| 0.6402777777777778 | 893.157 |
| 0.6409722222222222 | 893.157 |
| 0.6416666666666667 | 884.274 |
| 0.642361111111111 | 879.878 |
| 0.6430555555555556 | 875.511 |
| 0.6437499999999999 | 866.865 |
| 0.6444444444444445 | 858.335 |
| 0.6451388888888888 | 854.113 |
| 0.6458333333333334 | 849.92 |
| 0.6465277777777778 | 845.755 |
| 0.6472222222222223 | 837.51 |
| 0.6479166666666667 | 833.43 |
| 0.6486111111111111 | 825.351 |
| 0.6493055555555556 | 817.382 |
| 0.65 | 813.439 |
| 0.6506944444444445 | 805.632 |
| 0.6513888888888889 | 801.768 |
| 0.6520833333333333 | 794.119 |
| 0.6527777777777778 | 786.575 |
| 0.6534722222222222 | 779.134 |
| 0.6541666666666667 | 775.451 |
| 0.6548611111111111 | 768.162 |
| 0.6555555555555556 | 760.972 |
| 0.65625 | 753.881 |
| 0.6569444444444444 | 746.886 |
| 0.6576388888888889 | 736.574 |
| 0.6583333333333333 | 729.817 |
| 0.6590277777777778 | 723.153 |
| 0.6597222222222222 | 716.58 |
| 0.6604166666666667 | 710.098 |
| 0.6611111111111111 | 703.704 |
| 0.6618055555555555 | 694.278 |
| 0.6625 | 682.011 |
| 0.6631944444444444 | 670.078 |
| 0.6638888888888889 | 661.343 |
| 0.6645833333333333 | 652.786 |
| 0.6652777777777777 | 647.179 |
| 0.6659722222222222 | 638.912 |
| 0.6666666666666666 | 630.814 |
| 0.6673611111111111 | 612.554 |
| 0.6680555555555556 | 590.321 |
| 0.6687500000000001 | 569.398 |
| 0.6694444444444444 | 553.97 |
| 0.6701388888888888 | 547.572 |
| 0.6708333333333334 | 543.376 |
| 0.6715277777777778 | 541.298 |
| 0.6722222222222222 | 537.182 |
| 0.6729166666666666 | 535.145 |
| 0.6736111111111112 | 531.108 |
| 0.6743055555555556 | 529.108 |
| 0.6749999999999999 | 525.148 |
| 0.6756944444444444 | 521.237 |
| 0.6763888888888889 | 517.375 |
| 0.6770833333333334 | 515.462 |
| 0.6777777777777777 | 509.793 |
| 0.6784722222222223 | 506.072 |
| 0.6791666666666667 | 502.396 |
| 0.6798611111111111 | 498.764 |
| 0.6805555555555555 | 495.176 |
| 0.68125 | 491.63 |
| 0.6819444444444445 | 489.873 |
| 0.6826388888888889 | 486.389 |
| 0.6833333333333332 | 482.945 |
| 0.6840277777777778 | 479.541 |
| 0.6847222222222222 | 477.854 |
| 0.6854166666666667 | 474.507 |
| 0.686111111111111 | 471.198 |
| 0.6868055555555556 | 467.925 |
| 0.6875 | 466.302 |
| 0.6881944444444444 | 463.083 |
| 0.688888888888889 | 459.898 |
| 0.6895833333333333 | 456.747 |
| 0.6902777777777778 | 453.629 |
| 0.6909722222222222 | 450.542 |
| 0.6916666666666668 | 447.487 |
| 0.6923611111111111 | 444.463 |
| 0.6930555555555555 | 441.469 |
| 0.69375 | 438.503 |
| 0.6944444444444445 | 435.566 |
| 0.6951388888888889 | 431.211 |
| 0.6958333333333333 | 428.341 |
| 0.6965277777777777 | 425.497 |
| 0.6972222222222223 | 422.678 |
| 0.6979166666666666 | 418.495 |
| 0.6986111111111111 | 414.364 |
| 0.6993055555555556 | 411.638 |
| 0.7000000000000001 | 407.589 |
| 0.7006944444444444 | 403.587 |
| 0.7013888888888888 | 399.628 |
| 0.7020833333333334 | 395.711 |
| 0.7027777777777778 | 391.834 |
| 0.7034722222222222 | 387.995 |
| 0.7041666666666666 | 382.93 |
| 0.7048611111111112 | 379.171 |
| 0.7055555555555556 | 374.206 |
| 0.7062499999999999 | 369.291 |
| 0.7069444444444444 | 365.635 |
| 0.7076388888888889 | 360.798 |
| 0.7083333333333334 | 355.999 |
| 0.7090277777777777 | 351.235 |
| 0.7097222222222223 | 346.501 |
| 0.7104166666666667 | 341.794 |
| 0.7111111111111111 | 337.109 |
| 0.7118055555555555 | 332.443 |
| 0.7125 | 326.633 |
| 0.7131944444444445 | 320.84 |
| 0.7138888888888889 | 316.215 |
| 0.7145833333333332 | 310.439 |
| 0.7152777777777778 | 304.664 |
| 0.7159722222222222 | 297.728 |
| 0.7166666666666667 | 291.937 |
| 0.717361111111111 | 286.13 |
| 0.7180555555555556 | 279.136 |
| 0.71875 | 273.281 |
| 0.7194444444444444 | 266.216 |
| 0.720138888888889 | 259.104 |
| 0.7208333333333333 | 251.939 |
| 0.7215277777777778 | 244.717 |
| 0.7222222222222222 | 237.433 |
| 0.7229166666666668 | 227.618 |
| 0.7236111111111111 | 216.43 |
| 0.7243055555555555 | 203.807 |
| 0.725 | 187.091 |
| 0.7256944444444445 | 171.353 |
| 0.7263888888888889 | 156.678 |
| 0.7270833333333333 | 143.144 |
| 0.7277777777777777 | 132.196 |
| 0.7284722222222223 | 122.538 |
| 0.7291666666666666 | 114.207 |
| 0.7298611111111111 | 105.834 |
| 0.7305555555555556 | 98.83 |
| 0.7312500000000001 | 91.806 |
| 0.7319444444444444 | 84.766 |
| 0.7326388888888888 | 77.715 |
| 0.7333333333333334 | 72.069 |
| 0.7340277777777778 | 66.423 |
| 0.7347222222222222 | 59.368 |
| 0.7354166666666666 | 53.73 |
| 0.7361111111111112 | 48.1 |
| 0.7368055555555556 | 43.886 |
| 0.7374999999999999 | 39.68 |
| 0.7381944444444444 | 36.881 |
| 0.7388888888888889 | 34.086 |
| 0.7395833333333334 | 31.297 |
| 0.7402777777777777 | 28.514 |
| 0.7409722222222223 | 25.736 |
| 0.7416666666666667 | 22.965 |
| 0.7423611111111111 | 20.201 |
| 0.7430555555555555 | 17.444 |
| 0.74375 | 14.696 |
| 0.7444444444444445 | 11.956 |
| 0.7451388888888889 | 10.589 |
| 0.7458333333333332 | 7.862 |
| 0.7465277777777778 | 6.503 |
| 0.7472222222222222 | 5.146 |
| 0.7479166666666667 | 3.791 |
| 0.748611111111111 | 3.791 |
| 0.7493055555555556 | 2.439 |
| 0.75 | 1.09 |
| 0.7506944444444444 | 1.09 |
| 0.751388888888889 | 1.09 |
| 0.7520833333333333 | -0.256 |
| 0.7527777777777778 | -0.256 |
| 0.7534722222222222 | -0.256 |
| 0.7541666666666668 | -0.256 |
| 0.7548611111111111 | -0.256 |
| 0.7555555555555555 | -0.256 |
| 0.75625 | -0.256 |
| 0.7569444444444445 | -0.256 |
| 0.7576388888888889 | -0.256 |
| 0.7583333333333333 | -0.256 |
| 0.7590277777777777 | -0.256 |
| 0.7597222222222223 | -0.256 |
| 0.7604166666666666 | -0.256 |
| 0.7611111111111111 | -0.256 |
| 0.7618055555555556 | -0.256 |
| 0.7625000000000001 | -0.256 |
| 0.7631944444444444 | -0.256 |
| 0.7638888888888888 | -0.256 |
| 0.7645833333333334 | -0.256 |
| 0.7652777777777778 | -0.256 |
| 0.7659722222222222 | -0.256 |
| 0.7666666666666666 | -0.256 |
| 0.7673611111111112 | -0.256 |
| 0.7680555555555556 | -0.256 |
| 0.7687499999999999 | -0.256 |
| 0.7694444444444444 | -0.256 |
| 0.7701388888888889 | -0.256 |
| 0.7708333333333334 | -0.256 |
| 0.7715277777777777 | -0.256 |
| 0.7722222222222223 | -0.256 |
| 0.7729166666666667 | -0.256 |
| 0.7736111111111111 | -0.256 |
| 0.7743055555555555 | -0.256 |
| 0.775 | -0.256 |
| 0.7756944444444445 | -0.256 |
| 0.7763888888888889 | -0.256 |
| 0.7770833333333332 | -0.256 |
| 0.7777777777777778 | -0.256 |
| 0.7784722222222222 | -0.256 |
| 0.7791666666666667 | -0.256 |
| 0.779861111111111 | -0.256 |
| 0.7805555555555556 | -0.256 |
| 0.78125 | -0.256 |
| 0.7819444444444444 | -0.256 |
| 0.782638888888889 | -0.256 |
| 0.7833333333333333 | -0.256 |
| 0.7840277777777778 | -0.256 |
| 0.7847222222222222 | -0.256 |
| 0.7854166666666668 | -0.256 |
| 0.7861111111111111 | -0.256 |
| 0.7868055555555555 | -0.256 |
| 0.7875 | -0.256 |
| 0.7881944444444445 | -0.256 |
| 0.7888888888888889 | -0.256 |
| 0.7895833333333333 | -0.256 |
| 0.7902777777777777 | -0.256 |
| 0.7909722222222223 | -0.256 |
| 0.7916666666666666 | -0.256 |
| 0.7923611111111111 | -0.256 |
| 0.7930555555555556 | -0.256 |
| 0.7937500000000001 | -0.256 |
| 0.7944444444444444 | -0.256 |
| 0.7951388888888888 | -0.256 |
| 0.7958333333333334 | -0.256 |
| 0.7965277777777778 | -0.256 |
| 0.7972222222222222 | -0.256 |
| 0.7979166666666666 | -0.256 |
| 0.7986111111111112 | -0.256 |
| 0.7993055555555556 | -0.256 |
| 0.7999999999999999 | -0.256 |
| 0.8006944444444444 | -0.256 |
| 0.8013888888888889 | -0.256 |
| 0.8020833333333334 | -0.256 |
| 0.8027777777777777 | -0.256 |
| 0.8034722222222223 | -0.256 |
| 0.8041666666666667 | -0.256 |
| 0.8048611111111111 | -0.256 |
| 0.8055555555555555 | -0.256 |
| 0.80625 | -0.256 |
| 0.8069444444444445 | -0.256 |
| 0.8076388888888889 | -0.256 |
| 0.8083333333333332 | -0.256 |
| 0.8090277777777778 | -0.256 |
| 0.8097222222222222 | -0.256 |
| 0.8104166666666667 | -0.256 |
| 0.811111111111111 | -0.256 |
| 0.8118055555555556 | -0.256 |
| 0.8125 | -0.256 |
| 0.8131944444444444 | -0.256 |
| 0.813888888888889 | -0.256 |
| 0.8145833333333333 | -0.256 |
| 0.8152777777777778 | -0.256 |
| 0.8159722222222222 | -0.256 |
| 0.8166666666666668 | -0.256 |
| 0.8173611111111111 | -0.256 |
| 0.8180555555555555 | -0.256 |
| 0.81875 | -0.256 |
| 0.8194444444444445 | -0.256 |
| 0.8201388888888889 | -0.256 |
| 0.8208333333333333 | -0.256 |
| 0.8215277777777777 | -0.256 |
| 0.8222222222222223 | -0.256 |
| 0.8229166666666666 | -0.256 |
| 0.8236111111111111 | -0.256 |
| 0.8243055555555556 | -0.256 |
| 0.8250000000000001 | -0.256 |
| 0.8256944444444444 | -0.256 |
| 0.8263888888888888 | -0.256 |
| 0.8270833333333334 | -0.256 |
| 0.8277777777777778 | -0.256 |
| 0.8284722222222222 | -0.256 |
| 0.8291666666666666 | -0.256 |
| 0.8298611111111112 | -0.256 |
| 0.8305555555555556 | -0.256 |
| 0.8312499999999999 | -0.256 |
| 0.8319444444444444 | -0.256 |
| 0.8326388888888889 | -0.256 |
| 0.8333333333333334 | -0.256 |
| 0.8340277777777777 | -0.256 |
| 0.8347222222222223 | -0.256 |
| 0.8354166666666667 | -0.256 |
| 0.8361111111111111 | -0.256 |
| 0.8368055555555555 | -0.256 |
| 0.8375 | -0.256 |
| 0.8381944444444445 | -0.256 |
| 0.8388888888888889 | -0.256 |
| 0.8395833333333332 | -0.256 |
| 0.8402777777777778 | -0.256 |
| 0.8409722222222222 | -0.256 |
| 0.8416666666666667 | -0.256 |
| 0.842361111111111 | -0.256 |
| 0.8430555555555556 | -0.256 |
| 0.84375 | -0.256 |
| 0.8444444444444444 | -0.256 |
| 0.845138888888889 | -0.256 |
| 0.8458333333333333 | -0.256 |
| 0.8465277777777778 | -0.256 |
| 0.8472222222222222 | -0.256 |
| 0.8479166666666668 | -0.256 |
| 0.8486111111111111 | -0.256 |
| 0.8493055555555555 | -0.256 |
| 0.85 | -0.256 |
| 0.8506944444444445 | -0.256 |
| 0.8513888888888889 | -0.256 |
| 0.8520833333333333 | -0.256 |
| 0.8527777777777777 | -0.256 |
| 0.8534722222222223 | -0.256 |
| 0.8541666666666666 | -0.256 |
| 0.8548611111111111 | -0.256 |
| 0.8555555555555556 | -0.256 |
| 0.8562500000000001 | -0.256 |
| 0.8569444444444444 | -0.256 |
| 0.8576388888888888 | -0.256 |
| 0.8583333333333334 | -0.256 |
| 0.8590277777777778 | -0.256 |
| 0.8597222222222222 | -0.256 |
| 0.8604166666666666 | -0.256 |
| 0.8611111111111112 | -0.256 |
| 0.8618055555555556 | -0.256 |
| 0.8624999999999999 | -0.256 |
| 0.8631944444444444 | -0.256 |
| 0.8638888888888889 | -0.256 |
| 0.8645833333333334 | -0.256 |
| 0.8652777777777777 | -0.256 |
| 0.8659722222222223 | -0.256 |
| 0.8666666666666667 | -0.256 |
| 0.8673611111111111 | -0.256 |
| 0.8680555555555555 | -0.256 |
| 0.86875 | -0.256 |
| 0.8694444444444445 | -0.256 |
| 0.8701388888888889 | -0.256 |
| 0.8708333333333332 | -0.256 |
| 0.8715277777777778 | -0.256 |
| 0.8722222222222222 | -0.256 |
| 0.8729166666666667 | -0.256 |
| 0.873611111111111 | -0.256 |
| 0.8743055555555556 | -0.256 |
| 0.875 | -0.256 |
| 0.8756944444444444 | -0.256 |
| 0.876388888888889 | -0.256 |
| 0.8770833333333333 | -0.256 |
| 0.8777777777777778 | -0.256 |
| 0.8784722222222222 | -0.256 |
| 0.8791666666666668 | -0.256 |
| 0.8798611111111111 | -0.256 |
| 0.8805555555555555 | -0.256 |
| 0.88125 | -0.256 |
| 0.8819444444444445 | -0.256 |
| 0.8826388888888889 | -0.256 |
| 0.8833333333333333 | -0.256 |
| 0.8840277777777777 | -0.256 |
| 0.8847222222222223 | -0.256 |
| 0.8854166666666666 | -0.256 |
| 0.8861111111111111 | -0.256 |
| 0.8868055555555556 | -0.256 |
| 0.8875000000000001 | -0.256 |
| 0.8881944444444444 | -0.256 |
| 0.8888888888888888 | -0.256 |
| 0.8895833333333334 | -0.256 |
| 0.8902777777777778 | -0.256 |
| 0.8909722222222222 | -0.256 |
| 0.8916666666666666 | -0.256 |
| 0.8923611111111112 | -0.256 |
| 0.8930555555555556 | -0.256 |
| 0.8937499999999999 | -0.256 |
| 0.8944444444444444 | -0.256 |
| 0.8951388888888889 | -0.256 |
| 0.8958333333333334 | -0.256 |
| 0.8965277777777777 | -0.256 |
| 0.8972222222222223 | -0.256 |
| 0.8979166666666667 | -0.256 |
| 0.8986111111111111 | -0.256 |
| 0.8993055555555555 | -0.256 |
| 0.9 | -0.256 |
| 0.9006944444444445 | -0.256 |
| 0.9013888888888889 | -0.256 |
| 0.9020833333333332 | -0.256 |
| 0.9027777777777778 | -0.256 |
| 0.9034722222222222 | -0.256 |
| 0.9041666666666667 | -0.256 |
| 0.904861111111111 | -0.256 |
| 0.9055555555555556 | -0.256 |
| 0.90625 | -0.256 |
| 0.9069444444444444 | -0.256 |
| 0.907638888888889 | -0.256 |
| 0.9083333333333333 | -0.256 |
| 0.9090277777777778 | -0.256 |
| 0.9097222222222222 | -0.256 |
| 0.9104166666666668 | -0.256 |
| 0.9111111111111111 | -0.256 |
| 0.9118055555555555 | -0.256 |
| 0.9125 | -0.256 |
| 0.9131944444444445 | -0.256 |
| 0.9138888888888889 | -0.256 |
| 0.9145833333333333 | -0.256 |
| 0.9152777777777777 | -0.256 |
| 0.9159722222222223 | -0.256 |
| 0.9166666666666666 | -0.256 |
| 0.9173611111111111 | -0.256 |
| 0.9180555555555556 | -0.256 |
| 0.9187500000000001 | -0.256 |
| 0.9194444444444444 | -0.256 |
| 0.9201388888888888 | -0.256 |
| 0.9208333333333334 | -0.256 |
| 0.9215277777777778 | -0.256 |
| 0.9222222222222222 | -0.256 |
| 0.9229166666666666 | -0.256 |
| 0.9236111111111112 | -0.256 |
| 0.9243055555555556 | -0.256 |
| 0.9249999999999999 | -0.256 |
| 0.9256944444444444 | -0.256 |
| 0.9263888888888889 | -0.256 |
| 0.9270833333333334 | -0.256 |
| 0.9277777777777777 | -0.256 |
| 0.9284722222222223 | -0.256 |
| 0.9291666666666667 | -0.256 |
| 0.9298611111111111 | -0.256 |
| 0.9305555555555555 | -0.256 |
| 0.93125 | -0.256 |
| 0.9319444444444445 | -0.256 |
| 0.9326388888888889 | -0.256 |
| 0.9333333333333332 | -0.256 |
| 0.9340277777777778 | -0.256 |
| 0.9347222222222222 | -0.256 |
| 0.9354166666666667 | -0.256 |
| 0.936111111111111 | -0.256 |
| 0.9368055555555556 | -0.256 |
| 0.9375 | -0.256 |
| 0.9381944444444444 | -0.256 |
| 0.938888888888889 | -0.256 |
| 0.9395833333333333 | -0.256 |
| 0.9402777777777778 | -0.256 |
| 0.9409722222222222 | -0.256 |
| 0.9416666666666668 | -0.256 |
| 0.9423611111111111 | -0.256 |
| 0.9430555555555555 | -0.256 |
| 0.94375 | -0.256 |
| 0.9444444444444445 | -0.256 |
| 0.9451388888888889 | -0.256 |
| 0.9458333333333333 | -0.256 |
| 0.9465277777777777 | -0.256 |
| 0.9472222222222223 | -0.256 |
| 0.9479166666666666 | -0.256 |
| 0.9486111111111111 | -0.256 |
| 0.9493055555555556 | -0.256 |
| 0.9500000000000001 | -0.256 |
| 0.9506944444444444 | -0.256 |
| 0.9513888888888888 | -0.256 |
| 0.9520833333333334 | -0.256 |
| 0.9527777777777778 | -0.256 |
| 0.9534722222222222 | -0.256 |
| 0.9541666666666666 | -0.256 |
| 0.9548611111111112 | -0.256 |
| 0.9555555555555556 | -0.256 |
| 0.9562499999999999 | -0.256 |
| 0.9569444444444444 | -0.256 |
| 0.9576388888888889 | -0.256 |
| 0.9583333333333334 | -0.256 |
| 0.9590277777777777 | -0.256 |
| 0.9597222222222223 | -0.256 |
| 0.9604166666666667 | -0.256 |
| 0.9611111111111111 | -0.256 |
| 0.9618055555555555 | -0.256 |
| 0.9625 | -0.256 |
| 0.9631944444444445 | -0.256 |
| 0.9638888888888889 | -0.256 |
| 0.9645833333333332 | -0.256 |
| 0.9652777777777778 | -0.256 |
| 0.9659722222222222 | -0.256 |
| 0.9666666666666667 | -0.256 |
| 0.967361111111111 | -0.256 |
| 0.9680555555555556 | -0.256 |
| 0.96875 | -0.256 |
| 0.9694444444444444 | -0.256 |
| 0.970138888888889 | -0.256 |
| 0.9708333333333333 | -0.256 |
| 0.9715277777777778 | -0.256 |
| 0.9722222222222222 | -0.256 |
| 0.9729166666666668 | -0.256 |
| 0.9736111111111111 | -0.256 |
| 0.9743055555555555 | -0.256 |
| 0.975 | -0.256 |
| 0.9756944444444445 | -0.256 |
| 0.9763888888888889 | -0.256 |
| 0.9770833333333333 | -0.256 |
| 0.9777777777777777 | -0.256 |
| 0.9784722222222223 | -0.256 |
| 0.9791666666666666 | -0.256 |
| 0.9798611111111111 | -0.256 |
| 0.9805555555555556 | -0.256 |
| 0.9812500000000001 | -0.256 |
| 0.9819444444444444 | -0.256 |
| 0.9826388888888888 | -0.256 |
| 0.9833333333333334 | -0.256 |
| 0.9840277777777778 | -0.256 |
| 0.9847222222222222 | -0.256 |
| 0.9854166666666666 | -0.256 |
| 0.9861111111111112 | -0.256 |
| 0.9868055555555556 | -0.256 |
| 0.9874999999999999 | -0.256 |
| 0.9881944444444444 | -0.256 |
| 0.9888888888888889 | -0.256 |
| 0.9895833333333334 | -0.256 |
| 0.9902777777777777 | -0.256 |
| 0.9909722222222223 | -0.256 |
| 0.9916666666666667 | -0.256 |
| 0.9923611111111111 | -0.256 |
| 0.9930555555555555 | -0.256 |
| 0.99375 | -0.256 |
| 0.9944444444444445 | -0.256 |
| 0.9951388888888889 | -0.256 |
| 0.9958333333333332 | -0.256 |
| 0.9965277777777778 | -0.256 |
| 0.9972222222222222 | -0.256 |
| 0.9979166666666667 | -0.256 |
| 0.998611111111111 | -0.256 |
| 0.9993055555555556 | 0 |